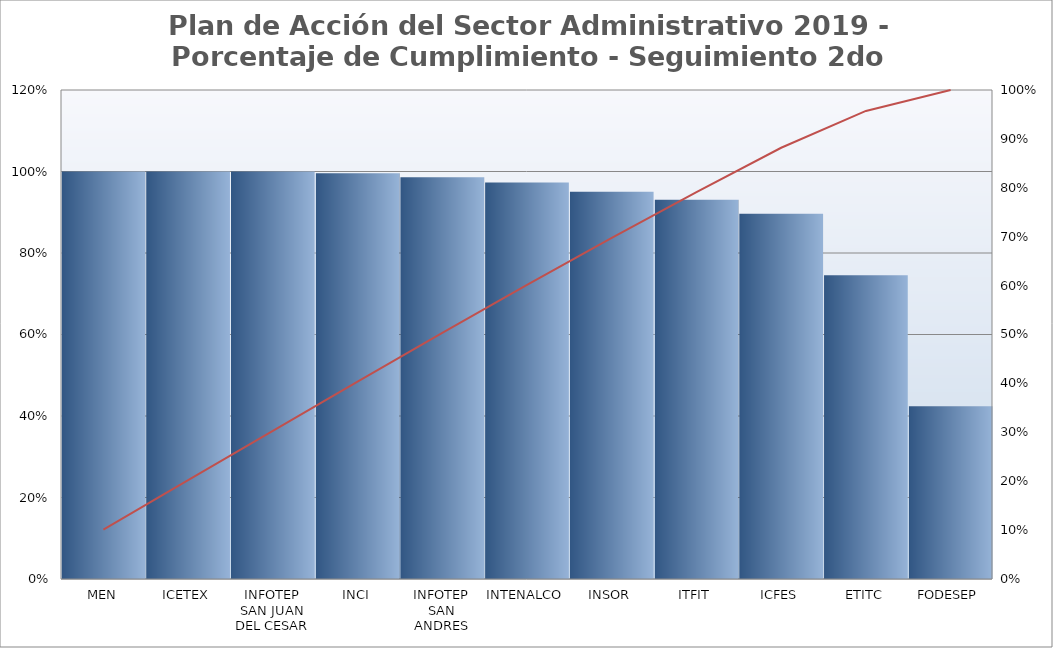
| Category | Promedio por Meta |
|---|---|
| Grupo 1 | 0.91 |
| Grupo 2 | 0.93 |
| Grupo 3 | 1 |